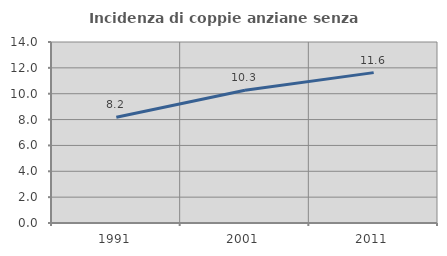
| Category | Incidenza di coppie anziane senza figli  |
|---|---|
| 1991.0 | 8.182 |
| 2001.0 | 10.265 |
| 2011.0 | 11.632 |